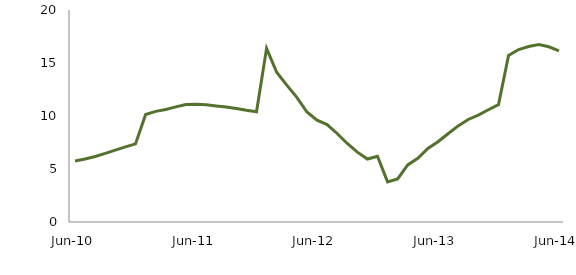
| Category | Series 0 |
|---|---|
| Jun-10 | 5.758 |
|  | 5.938 |
|  | 6.177 |
|  | 6.472 |
|  | 6.786 |
|  | 7.082 |
|  | 7.369 |
|  | 10.146 |
|  | 10.438 |
|  | 10.611 |
|  | 10.862 |
|  | 11.089 |
| Jun-11 | 11.108 |
|  | 11.056 |
|  | 10.952 |
|  | 10.857 |
|  | 10.717 |
|  | 10.538 |
|  | 10.395 |
|  | 16.386 |
|  | 14.123 |
|  | 12.918 |
|  | 11.755 |
|  | 10.374 |
| Jun-12 | 9.606 |
|  | 9.195 |
|  | 8.349 |
|  | 7.408 |
|  | 6.592 |
|  | 5.938 |
|  | 6.204 |
|  | 3.789 |
|  | 4.058 |
|  | 5.388 |
|  | 6.01 |
|  | 6.935 |
| Jun-13 | 7.567 |
|  | 8.326 |
|  | 9.065 |
|  | 9.672 |
|  | 10.081 |
|  | 10.588 |
|  | 11.067 |
|  | 15.71 |
|  | 16.267 |
|  | 16.561 |
|  | 16.745 |
|  | 16.528 |
| Jun-14 | 16.143 |